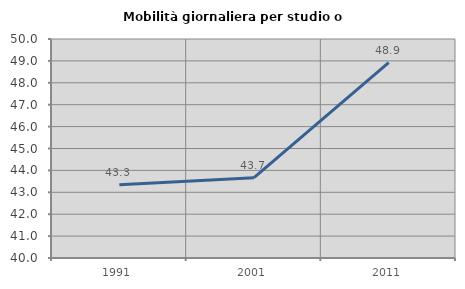
| Category | Mobilità giornaliera per studio o lavoro |
|---|---|
| 1991.0 | 43.348 |
| 2001.0 | 43.67 |
| 2011.0 | 48.918 |